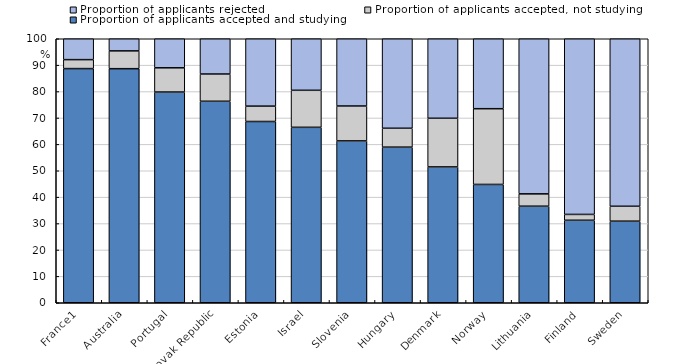
| Category | Proportion of applicants accepted and studying | Proportion of applicants accepted, not studying | Proportion of applicants rejected |
|---|---|---|---|
| France1 | 88.697 | 3.393 | 7.91 |
| Australia | 88.665 | 6.742 | 4.594 |
| Portugal | 79.82 | 9.175 | 11.006 |
| Slovak Republic | 76.32 | 10.327 | 13.353 |
| Estonia | 68.656 | 5.824 | 25.52 |
| Israel | 66.458 | 14.017 | 19.525 |
| Slovenia | 61.308 | 13.219 | 25.473 |
| Hungary | 58.947 | 7.152 | 33.901 |
| Denmark | 51.454 | 18.431 | 30.115 |
| Norway | 44.818 | 28.689 | 26.493 |
| Lithuania | 36.573 | 4.677 | 58.75 |
| Finland | 31.246 | 2.217 | 66.537 |
| Sweden | 30.906 | 5.643 | 63.451 |